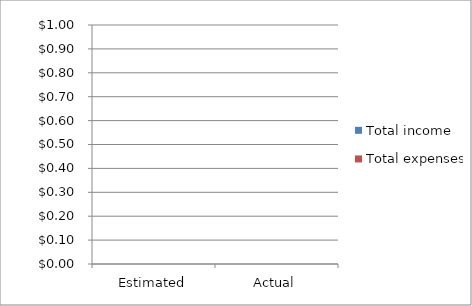
| Category | Total income | Total expenses |
|---|---|---|
| Estimated | 0 | 0 |
| Actual | 0 | 0 |